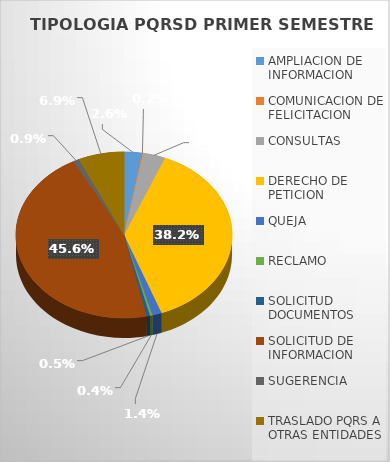
| Category | Series 0 |
|---|---|
| AMPLIACION DE INFORMACION | 15 |
| COMUNICACION DE FELICITACION  | 1 |
| CONSULTAS | 19 |
| DERECHO DE PETICION | 217 |
| QUEJA | 8 |
| RECLAMO | 2 |
| SOLICITUD DOCUMENTOS | 3 |
| SOLICITUD DE INFORMACION | 259 |
| SUGERENCIA | 5 |
| TRASLADO PQRS A OTRAS ENTIDADES | 39 |